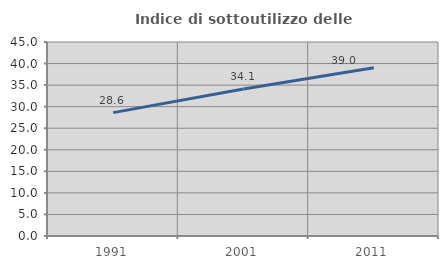
| Category | Indice di sottoutilizzo delle abitazioni  |
|---|---|
| 1991.0 | 28.613 |
| 2001.0 | 34.092 |
| 2011.0 | 39.006 |